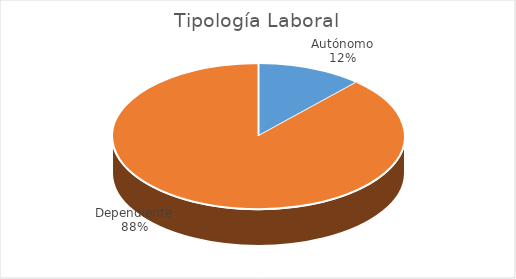
| Category | Total |
|---|---|
| Autónomo | 4 |
| Dependiente | 30 |